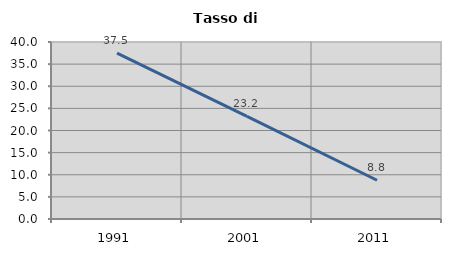
| Category | Tasso di disoccupazione   |
|---|---|
| 1991.0 | 37.483 |
| 2001.0 | 23.202 |
| 2011.0 | 8.751 |